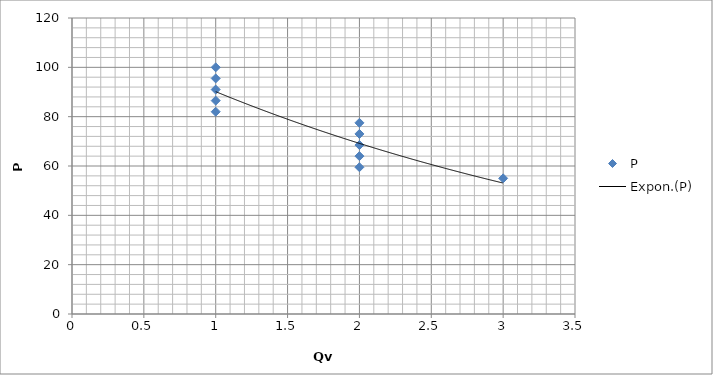
| Category | P |
|---|---|
| 3.0 | 55 |
| 2.0 | 59.5 |
| 2.0 | 64 |
| 2.0 | 68.5 |
| 2.0 | 73 |
| 2.0 | 77.5 |
| 1.0 | 82 |
| 1.0 | 86.5 |
| 1.0 | 91 |
| 1.0 | 95.5 |
| 1.0 | 100 |